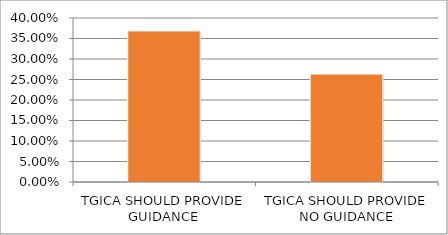
| Category | Series 0 |
|---|---|
| TGICA SHOULD PROVIDE GUIDANCE | 0.368 |
| TGICA SHOULD PROVIDE NO GUIDANCE | 0.263 |